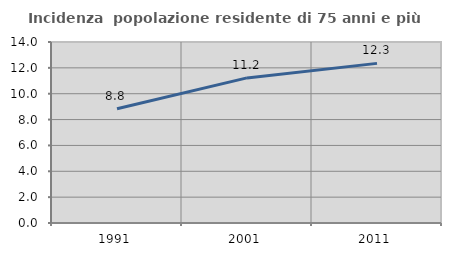
| Category | Incidenza  popolazione residente di 75 anni e più |
|---|---|
| 1991.0 | 8.831 |
| 2001.0 | 11.223 |
| 2011.0 | 12.347 |